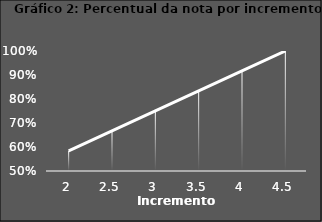
| Category | Series 0 |
|---|---|
| 2.0 | 0.583 |
| 2.5 | 0.667 |
| 3.0 | 0.75 |
| 3.5 | 0.833 |
| 4.0 | 0.917 |
| 4.5 | 1 |